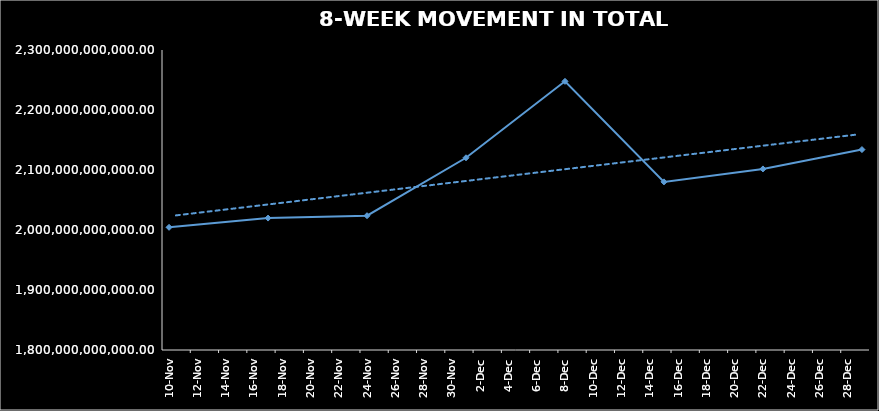
| Category | TOTAL NAV |
|---|---|
| 2023-11-10 | 2004454649356.778 |
| 2023-11-17 | 2019879952817.294 |
| 2023-11-24 | 2023797867882.851 |
| 2023-12-01 | 2120381651104.615 |
| 2023-12-08 | 2247779681993.516 |
| 2023-12-15 | 2080204371491.043 |
| 2023-12-22 | 2101781808992.513 |
| 2023-12-29 | 2134044598687.964 |